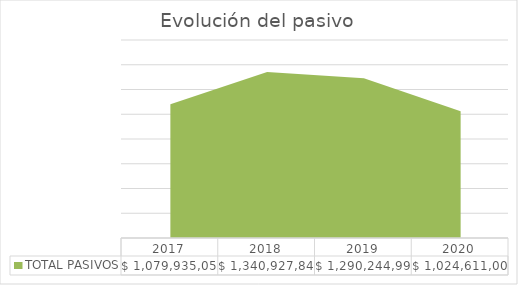
| Category | TOTAL PASIVOS |
|---|---|
| 2017.0 | 1079935056.63 |
| 2018.0 | 1340927840.7 |
| 2019.0 | 1290244990 |
| 2020.0 | 1024611000 |